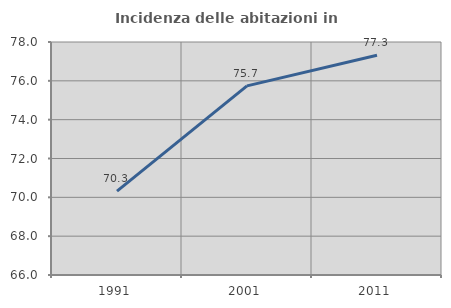
| Category | Incidenza delle abitazioni in proprietà  |
|---|---|
| 1991.0 | 70.321 |
| 2001.0 | 75.741 |
| 2011.0 | 77.318 |